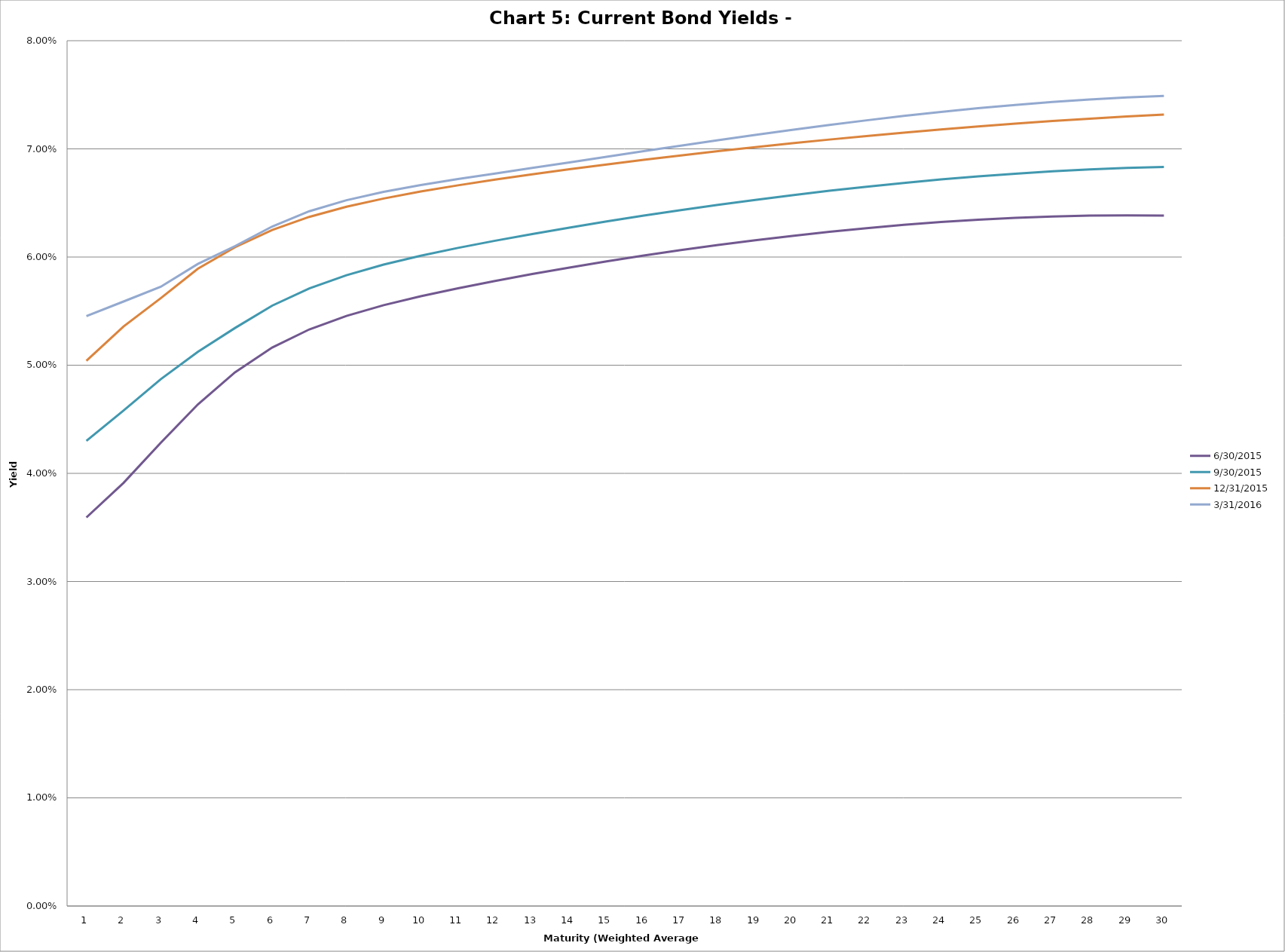
| Category | 6/30/2015 | 9/30/2015 | 12/31/2015 | 3/31/2016 |
|---|---|---|---|---|
| 0 | 0.036 | 0.043 | 0.05 | 0.055 |
| 1 | 0.039 | 0.046 | 0.054 | 0.056 |
| 2 | 0.043 | 0.049 | 0.056 | 0.057 |
| 3 | 0.046 | 0.051 | 0.059 | 0.059 |
| 4 | 0.049 | 0.053 | 0.061 | 0.061 |
| 5 | 0.052 | 0.056 | 0.063 | 0.063 |
| 6 | 0.053 | 0.057 | 0.064 | 0.064 |
| 7 | 0.055 | 0.058 | 0.065 | 0.065 |
| 8 | 0.056 | 0.059 | 0.065 | 0.066 |
| 9 | 0.056 | 0.06 | 0.066 | 0.067 |
| 10 | 0.057 | 0.061 | 0.067 | 0.067 |
| 11 | 0.058 | 0.062 | 0.067 | 0.068 |
| 12 | 0.058 | 0.062 | 0.068 | 0.068 |
| 13 | 0.059 | 0.063 | 0.068 | 0.069 |
| 14 | 0.06 | 0.063 | 0.069 | 0.069 |
| 15 | 0.06 | 0.064 | 0.069 | 0.07 |
| 16 | 0.061 | 0.064 | 0.069 | 0.07 |
| 17 | 0.061 | 0.065 | 0.07 | 0.071 |
| 18 | 0.062 | 0.065 | 0.07 | 0.071 |
| 19 | 0.062 | 0.066 | 0.071 | 0.072 |
| 20 | 0.062 | 0.066 | 0.071 | 0.072 |
| 21 | 0.063 | 0.067 | 0.071 | 0.073 |
| 22 | 0.063 | 0.067 | 0.071 | 0.073 |
| 23 | 0.063 | 0.067 | 0.072 | 0.073 |
| 24 | 0.063 | 0.067 | 0.072 | 0.074 |
| 25 | 0.064 | 0.068 | 0.072 | 0.074 |
| 26 | 0.064 | 0.068 | 0.073 | 0.074 |
| 27 | 0.064 | 0.068 | 0.073 | 0.075 |
| 28 | 0.064 | 0.068 | 0.073 | 0.075 |
| 29 | 0.064 | 0.068 | 0.073 | 0.075 |